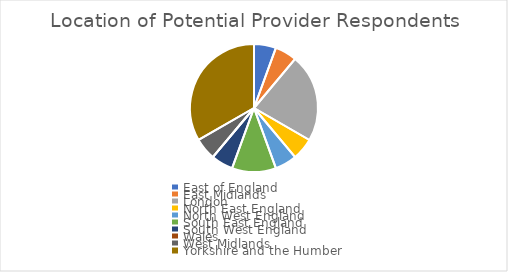
| Category | Number of respondents |
|---|---|
| East of England | 1 |
| East Midlands | 1 |
| London | 4 |
| North East England | 1 |
| North West England | 1 |
| South East England | 2 |
| South West England | 1 |
| Wales | 0 |
| West Midlands | 1 |
| Yorkshire and the Humber | 6 |